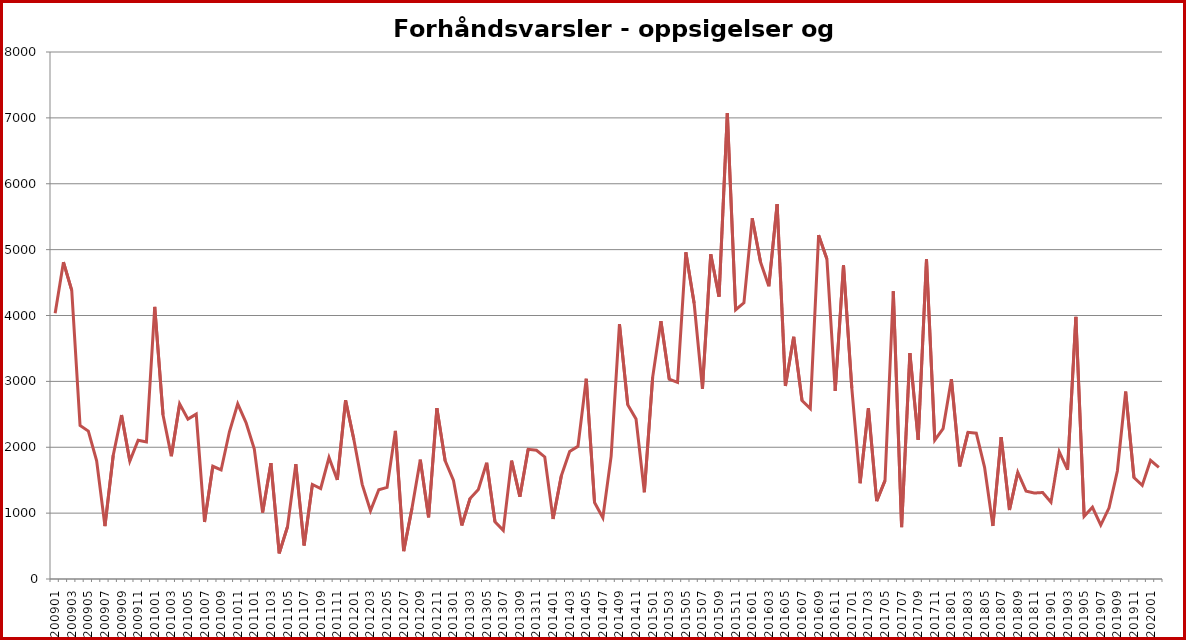
| Category | Series 1 |
|---|---|
| 200901.0 | 4035 |
| 200902.0 | 4810 |
| 200903.0 | 4381 |
| 200904.0 | 2332 |
| 200905.0 | 2245 |
| 200906.0 | 1794 |
| 200907.0 | 802 |
| 200908.0 | 1879 |
| 200909.0 | 2489 |
| 200910.0 | 1789 |
| 200911.0 | 2107 |
| 200912.0 | 2080 |
| 201001.0 | 4130 |
| 201002.0 | 2490 |
| 201003.0 | 1865 |
| 201004.0 | 2658 |
| 201005.0 | 2427 |
| 201006.0 | 2503 |
| 201007.0 | 866 |
| 201008.0 | 1711 |
| 201009.0 | 1655 |
| 201010.0 | 2235 |
| 201011.0 | 2658 |
| 201012.0 | 2374 |
| 201101.0 | 1971 |
| 201102.0 | 1008 |
| 201103.0 | 1759 |
| 201104.0 | 389 |
| 201105.0 | 794 |
| 201106.0 | 1744 |
| 201107.0 | 509 |
| 201108.0 | 1436 |
| 201109.0 | 1374 |
| 201110.0 | 1844 |
| 201111.0 | 1504 |
| 201112.0 | 2714 |
| 201201.0 | 2115 |
| 201202.0 | 1437 |
| 201203.0 | 1037 |
| 201204.0 | 1355 |
| 201205.0 | 1390 |
| 201206.0 | 2249 |
| 201207.0 | 423 |
| 201208.0 | 1073 |
| 201209.0 | 1812 |
| 201210.0 | 937 |
| 201211.0 | 2594 |
| 201212.0 | 1792 |
| 201301.0 | 1496 |
| 201302.0 | 813 |
| 201303.0 | 1223 |
| 201304.0 | 1358 |
| 201305.0 | 1765 |
| 201306.0 | 869 |
| 201307.0 | 738 |
| 201308.0 | 1797 |
| 201309.0 | 1250 |
| 201310.0 | 1969 |
| 201311.0 | 1954 |
| 201312.0 | 1853 |
| 201401.0 | 910 |
| 201402.0 | 1568 |
| 201403.0 | 1937 |
| 201404.0 | 2014 |
| 201405.0 | 3040 |
| 201406.0 | 1160 |
| 201407.0 | 929 |
| 201408.0 | 1866 |
| 201409.0 | 3868 |
| 201410.0 | 2646 |
| 201411.0 | 2429 |
| 201412.0 | 1317 |
| 201501.0 | 3062 |
| 201502.0 | 3915 |
| 201503.0 | 3035 |
| 201504.0 | 2985 |
| 201505.0 | 4960 |
| 201506.0 | 4185 |
| 201507.0 | 2888 |
| 201508.0 | 4930 |
| 201509.0 | 4286 |
| 201510.0 | 7072 |
| 201511.0 | 4087 |
| 201512.0 | 4193 |
| 201601.0 | 5475 |
| 201602.0 | 4812 |
| 201603.0 | 4444 |
| 201604.0 | 5691 |
| 201605.0 | 2931 |
| 201606.0 | 3676 |
| 201607.0 | 2709 |
| 201608.0 | 2588 |
| 201609.0 | 5220 |
| 201610.0 | 4857 |
| 201611.0 | 2855 |
| 201612.0 | 4761 |
| 201701.0 | 2898 |
| 201702.0 | 1454 |
| 201703.0 | 2594 |
| 201704.0 | 1182 |
| 201705.0 | 1494 |
| 201706.0 | 4368 |
| 201707.0 | 787 |
| 201708.0 | 3429 |
| 201709.0 | 2112 |
| 201710.0 | 4854 |
| 201711.0 | 2109 |
| 201712.0 | 2284 |
| 201801.0 | 3032 |
| 201802.0 | 1711 |
| 201803.0 | 2227 |
| 201804.0 | 2213 |
| 201805.0 | 1696 |
| 201806.0 | 805 |
| 201807.0 | 2153 |
| 201808.0 | 1048 |
| 201809.0 | 1619 |
| 201810.0 | 1334 |
| 201811.0 | 1305 |
| 201812.0 | 1313 |
| 201901.0 | 1166 |
| 201902.0 | 1930 |
| 201903.0 | 1658 |
| 201904.0 | 3980 |
| 201905.0 | 952 |
| 201906.0 | 1089 |
| 201907.0 | 819 |
| 201908.0 | 1080 |
| 201909.0 | 1640 |
| 201910.0 | 2846 |
| 201911.0 | 1540 |
| 201912.0 | 1421 |
| 202001.0 | 1801 |
| 202002.0 | 1695 |